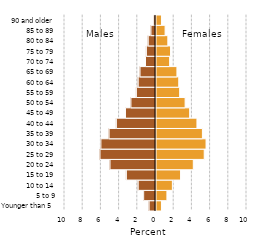
| Category | Series 0 |
|---|---|
| Younger than 5 | 0.6 |
| 5 to 9 | 1.2 |
| 10 to 14 | 1.8 |
| 15 to 19 | 2.7 |
| 20 to 24 | 4.1 |
| 25 to 29 | 5.3 |
| 30 to 34 | 5.5 |
| 35 to 39 | 5.1 |
| 40 to 44 | 4.5 |
| 45 to 49 | 3.7 |
| 50 to 54 | 3.2 |
| 55 to 59 | 2.6 |
| 60 to 64 | 2.5 |
| 65 to 69 | 2.3 |
| 70 to 74 | 1.5 |
| 75 to 79 | 1.6 |
| 80 to 84 | 1.3 |
| 85 to 89 | 1 |
| 90 and older | 0.6 |